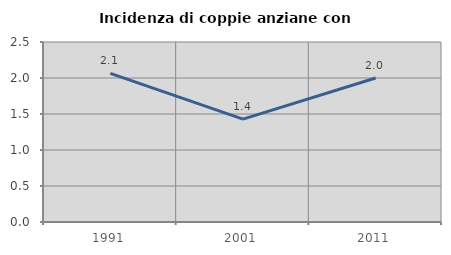
| Category | Incidenza di coppie anziane con figli |
|---|---|
| 1991.0 | 2.065 |
| 2001.0 | 1.429 |
| 2011.0 | 2 |